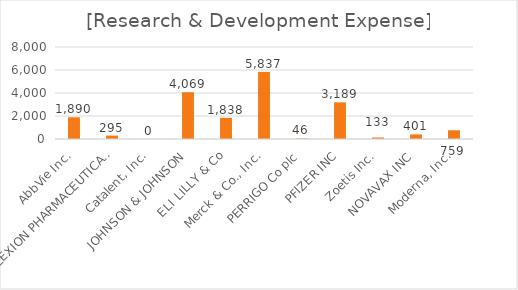
| Category | [Research & Development Expense] |
|---|---|
| AbbVie Inc. | 1890 |
| ALEXION PHARMACEUTICALS, INC. | 295 |
| Catalent, Inc. | 0 |
| JOHNSON & JOHNSON | 4069 |
| ELI LILLY & Co | 1838 |
| Merck & Co., Inc. | 5837 |
| PERRIGO Co plc | 46.1 |
| PFIZER INC | 3189 |
| Zoetis Inc. | 133 |
| NOVAVAX INC | 401.199 |
| Moderna, Inc. | 758.86 |